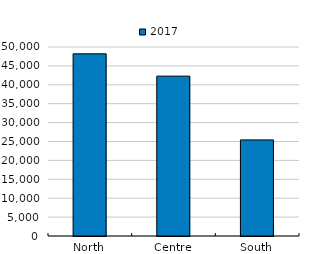
| Category | 2017 |
|---|---|
| North | 48196.78 |
| Centre | 42294.695 |
| South | 25422.918 |